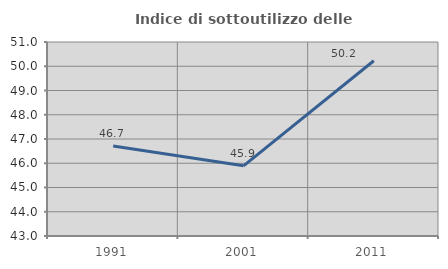
| Category | Indice di sottoutilizzo delle abitazioni  |
|---|---|
| 1991.0 | 46.715 |
| 2001.0 | 45.894 |
| 2011.0 | 50.225 |